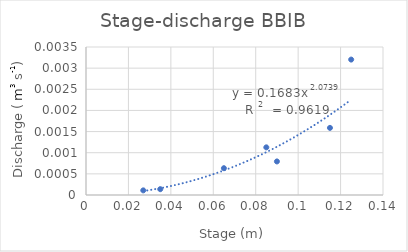
| Category | QA (m3/s) |
|---|---|
| 0.09 | 0.001 |
| 0.065 | 0.001 |
| 0.027 | 0 |
| 0.085 | 0.001 |
| 0.125 | 0.003 |
| 0.035 | 0 |
| 0.115 | 0.002 |